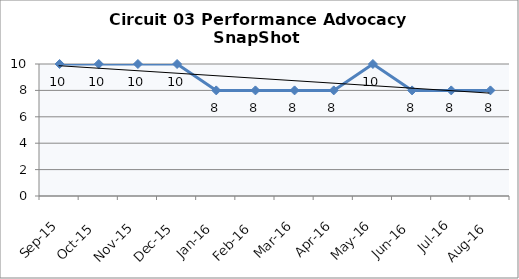
| Category | Circuit 03 |
|---|---|
| Sep-15 | 10 |
| Oct-15 | 10 |
| Nov-15 | 10 |
| Dec-15 | 10 |
| Jan-16 | 8 |
| Feb-16 | 8 |
| Mar-16 | 8 |
| Apr-16 | 8 |
| May-16 | 10 |
| Jun-16 | 8 |
| Jul-16 | 8 |
| Aug-16 | 8 |